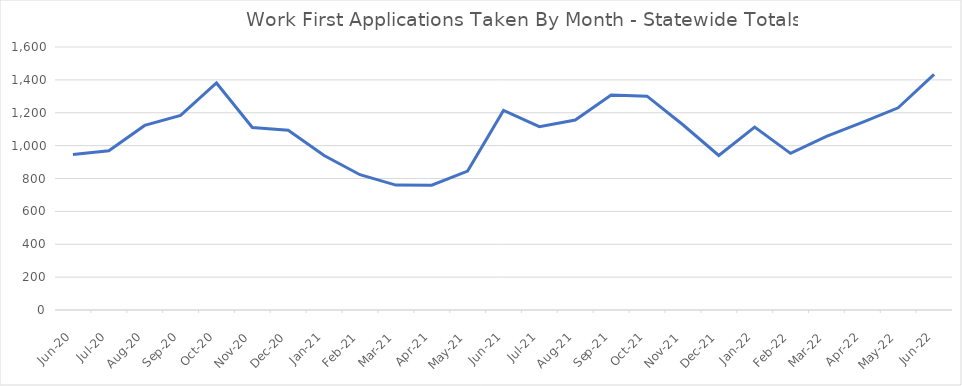
| Category | Series 0 |
|---|---|
| 2022-06-01 | 1433 |
| 2022-05-01 | 1230 |
| 2022-04-01 | 1142 |
| 2022-03-01 | 1056 |
| 2022-02-01 | 953 |
| 2022-01-01 | 1113 |
| 2021-12-02 | 940 |
| 2021-11-01 | 1127 |
| 2021-10-01 | 1301 |
| 2021-09-01 | 1308 |
| 2021-08-01 | 1156 |
| 2021-07-01 | 1115 |
| 2021-06-01 | 1214 |
| 2021-05-01 | 845 |
| 2021-04-01 | 759 |
| 2021-03-01 | 760 |
| 2021-02-01 | 823 |
| 2021-01-01 | 940 |
| 2020-12-01 | 1093 |
| 2020-11-01 | 1110 |
| 2020-10-01 | 1381 |
| 2020-09-01 | 1184 |
| 2020-08-01 | 1123 |
| 2020-07-01 | 969 |
| 2020-06-01 | 946 |